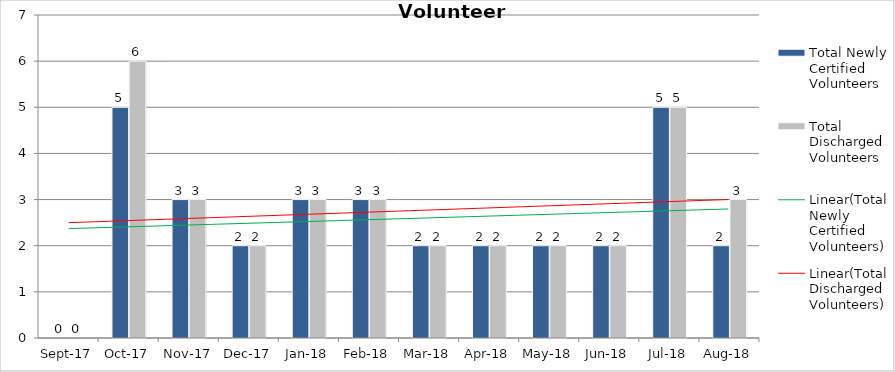
| Category | Total Newly Certified Volunteers | Total Discharged Volunteers |
|---|---|---|
| 2017-09-01 | 0 | 0 |
| 2017-10-01 | 5 | 6 |
| 2017-11-01 | 3 | 3 |
| 2017-12-01 | 2 | 2 |
| 2018-01-01 | 3 | 3 |
| 2018-02-01 | 3 | 3 |
| 2018-03-01 | 2 | 2 |
| 2018-04-01 | 2 | 2 |
| 2018-05-01 | 2 | 2 |
| 2018-06-01 | 2 | 2 |
| 2018-07-01 | 5 | 5 |
| 2018-08-01 | 2 | 3 |